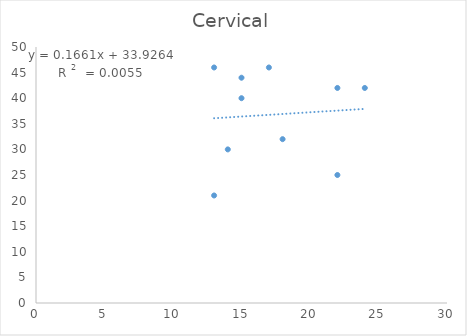
| Category | Cervical |
|---|---|
| 14.0 | 30 |
| 17.0 | 46 |
| 18.0 | 32 |
| 13.0 | 46 |
| 13.0 | 21 |
| 24.0 | 42 |
| 15.0 | 40 |
| 15.0 | 44 |
| 22.0 | 42 |
| 22.0 | 25 |